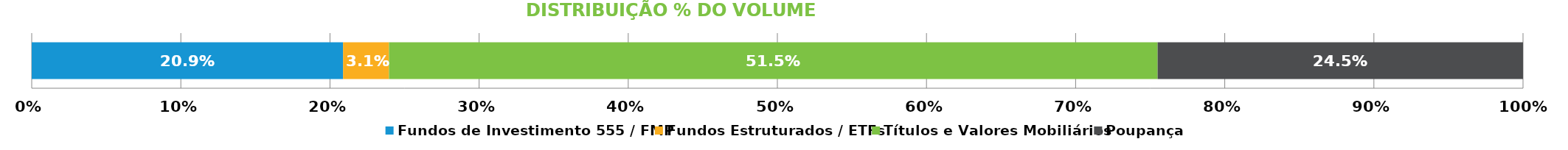
| Category | Fundos de Investimento 555 / FMP | Fundos Estruturados / ETFs | Títulos e Valores Mobiliários | Poupança |
|---|---|---|---|---|
| 0 | 0.209 | 0.031 | 0.515 | 0.245 |